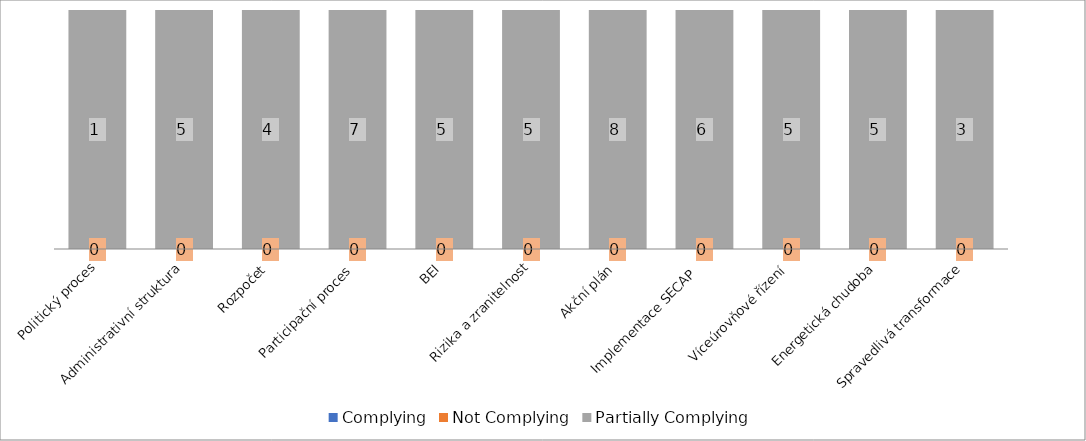
| Category | Complying | Not Complying | Partially Complying |
|---|---|---|---|
| Politický proces | 0 | 0 | 1 |
| Administrativní struktura | 0 | 0 | 5 |
| Rozpočet | 0 | 0 | 4 |
| Participační proces | 0 | 0 | 7 |
| BEI | 0 | 0 | 5 |
| Rizika a zranitelnost | 0 | 0 | 5 |
| Akční plán | 0 | 0 | 8 |
| Implementace SECAP  | 0 | 0 | 6 |
| Víceúrovňové řízení | 0 | 0 | 5 |
| Energetická chudoba | 0 | 0 | 5 |
| Spravedlivá transformace | 0 | 0 | 3 |